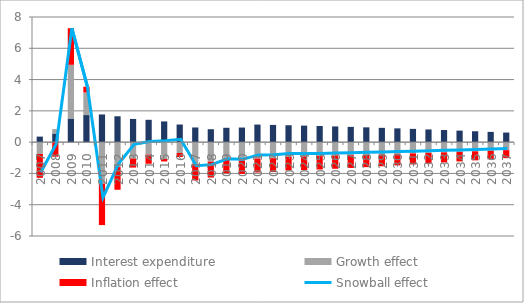
| Category | Interest expenditure | Growth effect | Inflation effect |
|---|---|---|---|
| 0 | 0.353 | -0.754 | -1.527 |
| 1 | 0.551 | 0.285 | -0.933 |
| 2 | 1.511 | 3.434 | 2.337 |
| 3 | 1.731 | 1.442 | 0.368 |
| 4 | 1.77 | -2.65 | -2.655 |
| 5 | 1.655 | -1.594 | -1.45 |
| 6 | 1.483 | -1.047 | -0.579 |
| 7 | 1.428 | -0.798 | -0.585 |
| 8 | 1.324 | -1.075 | -0.157 |
| 9 | 1.127 | -0.694 | -0.255 |
| 10 | 0.938 | -1.39 | -1.06 |
| 11 | 0.825 | -1.245 | -1.018 |
| 12 | 0.918 | -1.135 | -0.853 |
| 13 | 0.933 | -1.17 | -0.858 |
| 14 | 1.123 | -1.048 | -0.89 |
| 15 | 1.101 | -1.028 | -0.884 |
| 16 | 1.08 | -0.936 | -0.878 |
| 17 | 1.056 | -0.915 | -0.869 |
| 18 | 1.031 | -0.891 | -0.859 |
| 19 | 1.004 | -0.865 | -0.837 |
| 20 | 0.975 | -0.838 | -0.813 |
| 21 | 0.945 | -0.81 | -0.788 |
| 22 | 0.914 | -0.78 | -0.762 |
| 23 | 0.881 | -0.75 | -0.734 |
| 24 | 0.847 | -0.719 | -0.706 |
| 25 | 0.811 | -0.687 | -0.676 |
| 26 | 0.774 | -0.653 | -0.645 |
| 27 | 0.736 | -0.619 | -0.613 |
| 28 | 0.696 | -0.584 | -0.58 |
| 29 | 0.656 | -0.548 | -0.546 |
| 30 | 0.613 | -0.511 | -0.511 |